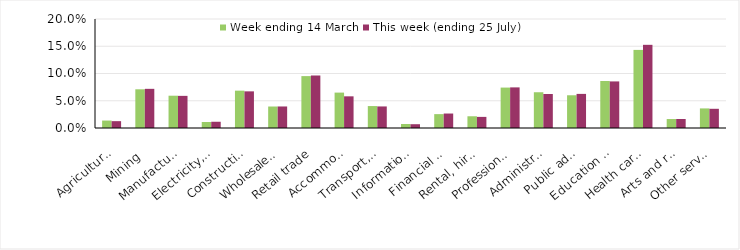
| Category | Week ending 14 March | This week (ending 25 July) |
|---|---|---|
| Agriculture, forestry and fishing | 0.014 | 0.013 |
| Mining | 0.071 | 0.072 |
| Manufacturing | 0.059 | 0.059 |
| Electricity, gas, water and waste services | 0.011 | 0.011 |
| Construction | 0.069 | 0.067 |
| Wholesale trade | 0.039 | 0.04 |
| Retail trade | 0.095 | 0.096 |
| Accommodation and food services | 0.065 | 0.058 |
| Transport, postal and warehousing | 0.04 | 0.04 |
| Information media and telecommunications | 0.007 | 0.007 |
| Financial and insurance services | 0.025 | 0.027 |
| Rental, hiring and real estate services | 0.022 | 0.02 |
| Professional, scientific and technical services | 0.074 | 0.075 |
| Administrative and support services | 0.066 | 0.062 |
| Public administration and safety | 0.06 | 0.063 |
| Education and training | 0.086 | 0.085 |
| Health care and social assistance | 0.143 | 0.153 |
| Arts and recreation services | 0.016 | 0.017 |
| Other services | 0.036 | 0.035 |